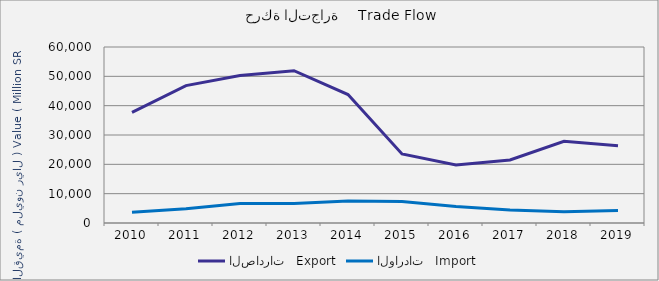
| Category | الصادرات   Export | الواردات   Import |
|---|---|---|
| 2010.0 | 37685232357 | 3648764367 |
| 2011.0 | 46847798622 | 4853005979 |
| 2012.0 | 50277389034 | 6621533080 |
| 2013.0 | 51920686365 | 6674963457 |
| 2014.0 | 43770672456 | 7459547235 |
| 2015.0 | 23523615780 | 7294214562 |
| 2016.0 | 19813772303 | 5585702683 |
| 2017.0 | 21510939134 | 4464827613 |
| 2018.0 | 27880976633 | 3816275412 |
| 2019.0 | 26363251203 | 4260151629 |